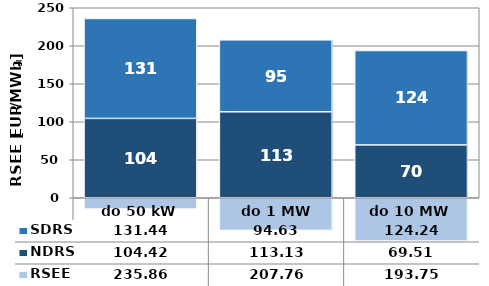
| Category | NDRS | SDRS |
|---|---|---|
| do 50 kW | 104.42 | 131.44 |
|  do 1 MW | 113.13 | 94.63 |
| do 10 MW | 69.51 | 124.24 |